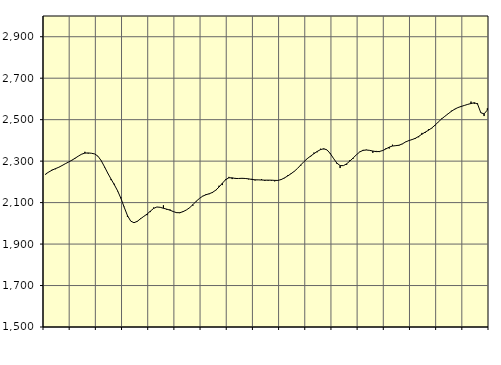
| Category | Piggar | Series 1 |
|---|---|---|
| nan | 2235.2 | 2238.07 |
| 87.0 | 2248 | 2247.77 |
| 87.0 | 2258.7 | 2256.79 |
| 87.0 | 2261.1 | 2263.73 |
| nan | 2269.2 | 2270.29 |
| 88.0 | 2278.3 | 2278.61 |
| 88.0 | 2286.8 | 2287.31 |
| 88.0 | 2295.1 | 2295.56 |
| nan | 2302.8 | 2304.44 |
| 89.0 | 2315.4 | 2313.88 |
| 89.0 | 2324.6 | 2324.27 |
| 89.0 | 2334.2 | 2333.53 |
| nan | 2344.9 | 2338.76 |
| 90.0 | 2336.5 | 2339.51 |
| 90.0 | 2337.7 | 2338.01 |
| 90.0 | 2334.8 | 2334.57 |
| nan | 2324.6 | 2323.56 |
| 91.0 | 2302.7 | 2301.9 |
| 91.0 | 2269.9 | 2272.43 |
| 91.0 | 2240.9 | 2241.71 |
| nan | 2208.5 | 2213.39 |
| 92.0 | 2190.7 | 2186.06 |
| 92.0 | 2154.6 | 2156.76 |
| 92.0 | 2125.3 | 2120.67 |
| nan | 2079.9 | 2078.05 |
| 93.0 | 2031 | 2037.69 |
| 93.0 | 2010.7 | 2010.76 |
| 93.0 | 2003.6 | 2002.97 |
| nan | 2011.4 | 2009.57 |
| 94.0 | 2024.1 | 2021.88 |
| 94.0 | 2034.2 | 2033.52 |
| 94.0 | 2039.3 | 2044.78 |
| nan | 2054.3 | 2058.54 |
| 95.0 | 2076.3 | 2071.97 |
| 95.0 | 2078.9 | 2078.75 |
| 95.0 | 2077.3 | 2077.29 |
| nan | 2086.9 | 2072.66 |
| 96.0 | 2065.4 | 2068.48 |
| 96.0 | 2067 | 2063.51 |
| 96.0 | 2057.8 | 2056.82 |
| nan | 2049.8 | 2051.5 |
| 97.0 | 2049.3 | 2051.26 |
| 97.0 | 2058.5 | 2056.44 |
| 97.0 | 2064.6 | 2064.35 |
| nan | 2074.3 | 2075.24 |
| 98.0 | 2085 | 2090.03 |
| 98.0 | 2108 | 2106.24 |
| 98.0 | 2119.9 | 2119.99 |
| nan | 2132.3 | 2130.99 |
| 99.0 | 2140.6 | 2137.99 |
| 99.0 | 2140.8 | 2142.72 |
| 99.0 | 2146.2 | 2149.23 |
| nan | 2158.8 | 2160.11 |
| 0.0 | 2181.5 | 2175.11 |
| 0.0 | 2184.5 | 2193.18 |
| 0.0 | 2213.5 | 2210.47 |
| nan | 2224 | 2219.69 |
| 1.0 | 2213.5 | 2219.41 |
| 1.0 | 2219 | 2216.24 |
| 1.0 | 2216.7 | 2216.34 |
| nan | 2218.3 | 2217.19 |
| 2.0 | 2217.2 | 2216.32 |
| 2.0 | 2212.2 | 2214.56 |
| 2.0 | 2214.5 | 2211.74 |
| nan | 2206.9 | 2209.84 |
| 3.0 | 2210.1 | 2209.61 |
| 3.0 | 2213 | 2208.93 |
| 3.0 | 2204.3 | 2208.23 |
| nan | 2205.4 | 2208.25 |
| 4.0 | 2205.4 | 2208.12 |
| 4.0 | 2202.5 | 2207.12 |
| 4.0 | 2206.9 | 2206.9 |
| nan | 2213.6 | 2211.21 |
| 5.0 | 2217.8 | 2219.19 |
| 5.0 | 2232.2 | 2228.64 |
| 5.0 | 2240.9 | 2239.33 |
| nan | 2252.1 | 2251.02 |
| 6.0 | 2265 | 2265.19 |
| 6.0 | 2278.8 | 2282.04 |
| 6.0 | 2298.2 | 2298.35 |
| nan | 2311 | 2312.62 |
| 7.0 | 2322.2 | 2324.66 |
| 7.0 | 2341.2 | 2335.86 |
| 7.0 | 2342.8 | 2346.71 |
| nan | 2359.7 | 2355.52 |
| 8.0 | 2357.1 | 2359.75 |
| 8.0 | 2354.1 | 2354.13 |
| 8.0 | 2339.2 | 2336.35 |
| nan | 2311.8 | 2312.71 |
| 9.0 | 2287.5 | 2290.52 |
| 9.0 | 2266.7 | 2278.63 |
| 9.0 | 2278.2 | 2278.28 |
| nan | 2282.3 | 2287.14 |
| 10.0 | 2305 | 2300.58 |
| 10.0 | 2312.3 | 2315.52 |
| 10.0 | 2330.4 | 2330.89 |
| nan | 2345.2 | 2344.21 |
| 11.0 | 2354 | 2352.03 |
| 11.0 | 2355.2 | 2353.64 |
| 11.0 | 2351.3 | 2351.99 |
| nan | 2340.1 | 2348.71 |
| 12.0 | 2349.4 | 2345.75 |
| 12.0 | 2343.6 | 2346.48 |
| 12.0 | 2352.7 | 2351.11 |
| nan | 2361.9 | 2358.79 |
| 13.0 | 2360.7 | 2367.5 |
| 13.0 | 2379.2 | 2372.9 |
| 13.0 | 2375.5 | 2374.61 |
| nan | 2375 | 2376.63 |
| 14.0 | 2381.9 | 2383.1 |
| 14.0 | 2393 | 2392.26 |
| 14.0 | 2398.1 | 2399.21 |
| nan | 2404.8 | 2403.98 |
| 15.0 | 2407.3 | 2410.09 |
| 15.0 | 2415.2 | 2419.29 |
| 15.0 | 2436.1 | 2429.81 |
| nan | 2435.9 | 2439.86 |
| 16.0 | 2453.5 | 2448.86 |
| 16.0 | 2458 | 2459.68 |
| 16.0 | 2471.2 | 2473.39 |
| nan | 2488.1 | 2488.8 |
| 17.0 | 2505.1 | 2503.39 |
| 17.0 | 2516.5 | 2516.1 |
| 17.0 | 2527.5 | 2528.2 |
| nan | 2543 | 2540.29 |
| 18.0 | 2548.4 | 2550.57 |
| 18.0 | 2558.2 | 2558.23 |
| 18.0 | 2561.6 | 2563.8 |
| nan | 2568.2 | 2568.78 |
| 19.0 | 2573.1 | 2573.79 |
| 19.0 | 2587.1 | 2577.85 |
| 19.0 | 2576.3 | 2581.71 |
| nan | 2578.7 | 2575.51 |
| 20.0 | 2534.7 | 2533.43 |
| 20.0 | 2517.4 | 2527.86 |
| 20.0 | 2554.8 | 2546.4 |